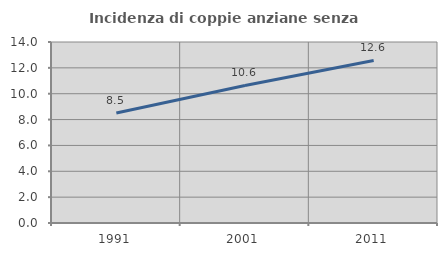
| Category | Incidenza di coppie anziane senza figli  |
|---|---|
| 1991.0 | 8.506 |
| 2001.0 | 10.64 |
| 2011.0 | 12.571 |